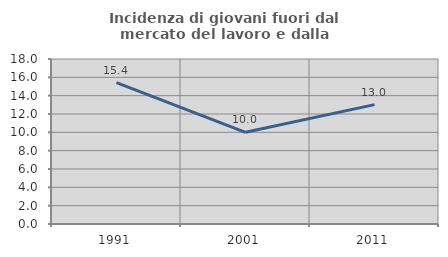
| Category | Incidenza di giovani fuori dal mercato del lavoro e dalla formazione  |
|---|---|
| 1991.0 | 15.426 |
| 2001.0 | 10 |
| 2011.0 | 13.023 |